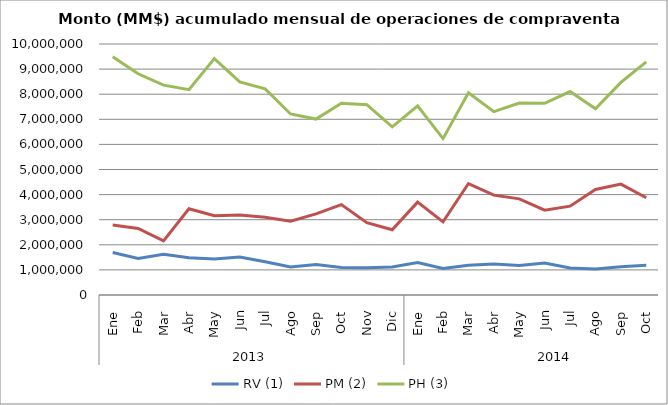
| Category | RV (1) | PM (2) | PH (3) |
|---|---|---|---|
| 0 | 1693090.019 | 2788692.01 | 9495719.157 |
| 1 | 1457870.523 | 2652319.476 | 8814454.346 |
| 2 | 1619570.46 | 2155113.626 | 8361658.957 |
| 3 | 1485677.791 | 3434435.881 | 8182321.991 |
| 4 | 1434943.507 | 3155786.06 | 9417818.094 |
| 5 | 1516566.545 | 3191285.457 | 8490151.421 |
| 6 | 1322115.523 | 3099755.507 | 8212010.547 |
| 7 | 1118245.895 | 2937089.197 | 7211658.784 |
| 8 | 1215047.725 | 3232334.418 | 7008526.172 |
| 9 | 1092035.083 | 3603082.09 | 7640993.748 |
| 10 | 1088055.605 | 2879188.198 | 7583918.365 |
| 11 | 1114851.326 | 2596986.123 | 6700659.979 |
| 12 | 1296256.43 | 3700290.091 | 7538361.261 |
| 13 | 1061199.219 | 2915830.381 | 6230064.605 |
| 14 | 1189463.212 | 4440910.02 | 8058380.739 |
| 15 | 1231035.305 | 3977428.452 | 7305106.144 |
| 16 | 1178985.046 | 3830415.456 | 7649023.753 |
| 17 | 1271543.287 | 3377453.657 | 7635505.378 |
| 18 | 1074038.901 | 3538491.307 | 8103978.154 |
| 19 | 1039238.343 | 4203748.491 | 7419437.742 |
| 20 | 1122686.945 | 4418671.366 | 8468015.825 |
| 21 | 1187018.073 | 3874404.728 | 9290296.839 |